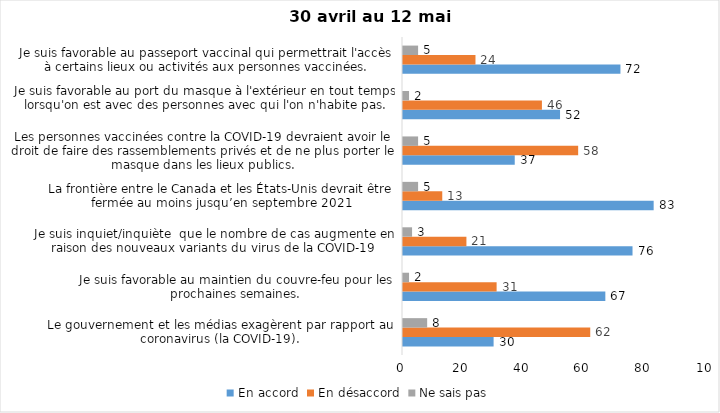
| Category | En accord | En désaccord | Ne sais pas |
|---|---|---|---|
| Le gouvernement et les médias exagèrent par rapport au coronavirus (la COVID-19). | 30 | 62 | 8 |
| Je suis favorable au maintien du couvre-feu pour les prochaines semaines. | 67 | 31 | 2 |
| Je suis inquiet/inquiète  que le nombre de cas augmente en raison des nouveaux variants du virus de la COVID-19 | 76 | 21 | 3 |
| La frontière entre le Canada et les États-Unis devrait être fermée au moins jusqu’en septembre 2021 | 83 | 13 | 5 |
| Les personnes vaccinées contre la COVID-19 devraient avoir le droit de faire des rassemblements privés et de ne plus porter le masque dans les lieux publics. | 37 | 58 | 5 |
| Je suis favorable au port du masque à l'extérieur en tout temps lorsqu'on est avec des personnes avec qui l'on n'habite pas. | 52 | 46 | 2 |
| Je suis favorable au passeport vaccinal qui permettrait l'accès à certains lieux ou activités aux personnes vaccinées. | 72 | 24 | 5 |